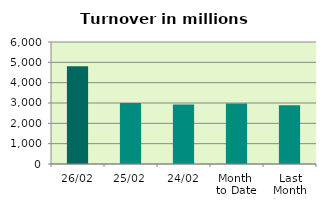
| Category | Series 0 |
|---|---|
| 26/02 | 4807.682 |
| 25/02 | 2998.268 |
| 24/02 | 2928.278 |
| Month 
to Date | 2972.107 |
| Last
Month | 2888.221 |